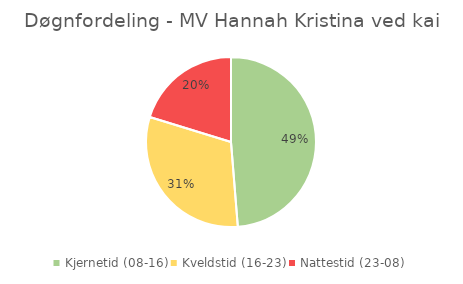
| Category | Series 0 |
|---|---|
| Kjernetid (08-16) | 0.487 |
| Kveldstid (16-23) | 0.31 |
| Nattestid (23-08) | 0.202 |